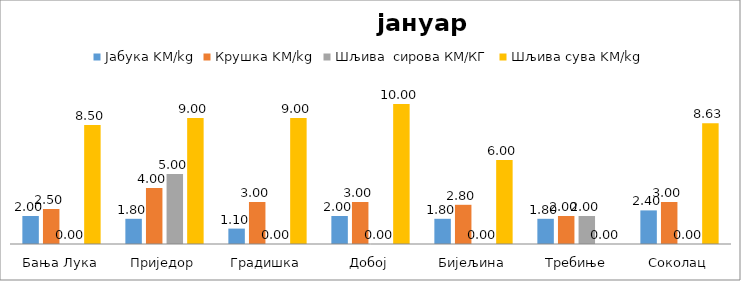
| Category | Јабука KM/kg | Крушка KM/kg | Шљива  сирова КМ/КГ | Шљива сува KM/kg |
|---|---|---|---|---|
| Бања Лука | 2 | 2.5 | 0 | 8.5 |
| Приједор | 1.8 | 4 | 5 | 9 |
| Градишка | 1.1 | 3 | 0 | 9 |
| Добој | 2 | 3 | 0 | 10 |
| Бијељина | 1.8 | 2.8 | 0 | 6 |
|  Требиње | 1.8 | 2 | 2 | 0 |
| Соколац | 2.4 | 3 | 0 | 8.625 |